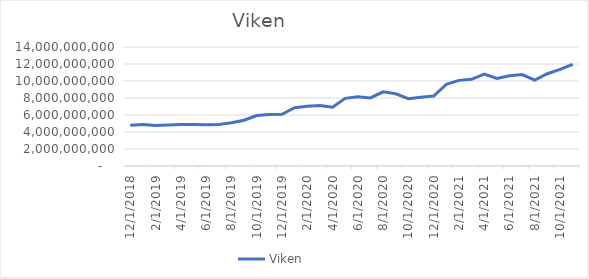
| Category | Viken |
|---|---|
| 12/1/18 | 4808547833.333 |
| 1/1/19 | 4870366583.333 |
| 2/1/19 | 4767533250 |
| 3/1/19 | 4827899916.667 |
| 4/1/19 | 4871147833.333 |
| 5/1/19 | 4885676583.333 |
| 6/1/19 | 4851922416.667 |
| 7/1/19 | 4895553583.333 |
| 8/1/19 | 5084708750 |
| 9/1/19 | 5379679583.333 |
| 10/1/19 | 5935270416.667 |
| 11/1/19 | 6047628750 |
| 12/1/19 | 6072978750 |
| 1/1/20 | 6857303750 |
| 2/1/20 | 7024387083.333 |
| 3/1/20 | 7112999583.333 |
| 4/1/20 | 6921314583.333 |
| 5/1/20 | 7960487500 |
| 6/1/20 | 8149891666.667 |
| 7/1/20 | 8007671666.667 |
| 8/1/20 | 8729271666.667 |
| 9/1/20 | 8492589166.667 |
| 10/1/20 | 7926272500 |
| 11/1/20 | 8086964166.667 |
| 12/1/20 | 8231868333.333 |
| 1/1/21 | 9595630833.333 |
| 2/1/21 | 10073776666.667 |
| 3/1/21 | 10203035000 |
| 4/1/21 | 10814301666.667 |
| 5/1/21 | 10293735000 |
| 6/1/21 | 10619669166.667 |
| 7/1/21 | 10756589166.667 |
| 8/1/21 | 10108464166.667 |
| 9/1/21 | 10854184166.667 |
| 10/1/21 | 11372788333.333 |
| 11/1/21 | 11959905000 |